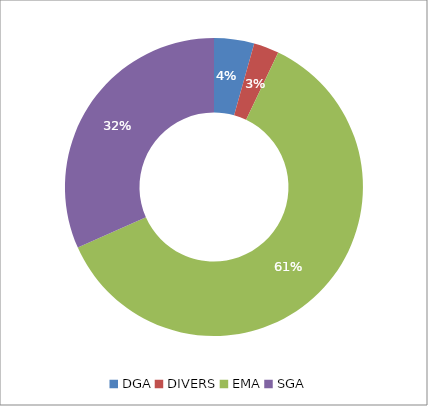
| Category | Series 0 |
|---|---|
| DGA | 165 |
| DIVERS | 104 |
| EMA | 2323 |
| SGA | 1200 |